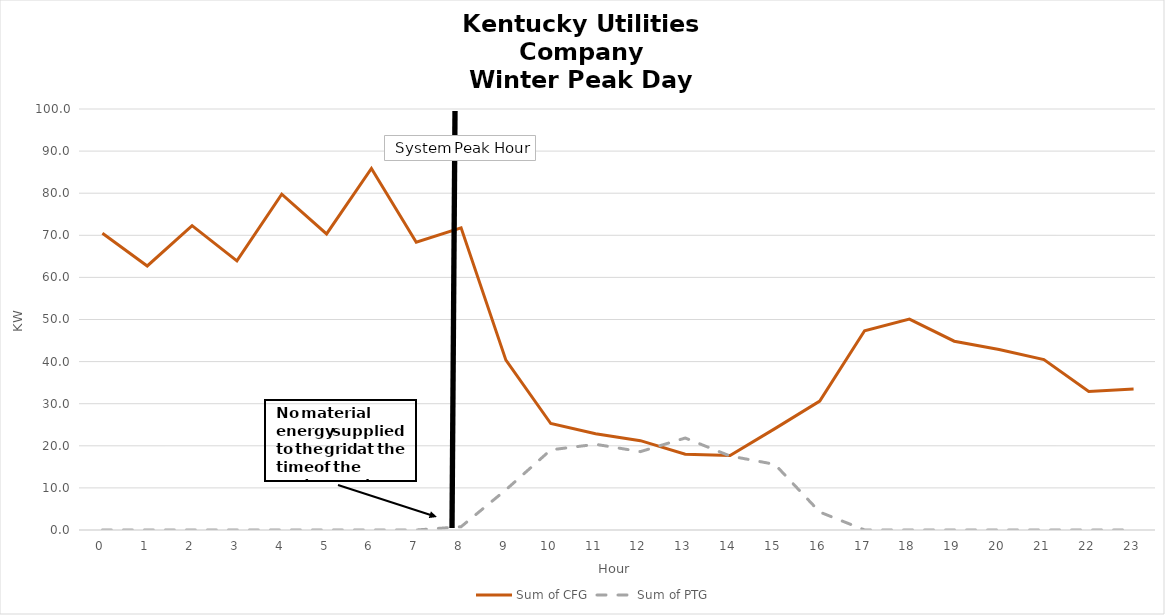
| Category | Sum of CFG | Sum of PTG |
|---|---|---|
| 0.0 | 70.485 | 0 |
| 1.0 | 62.716 | 0 |
| 2.0 | 72.306 | 0 |
| 3.0 | 63.927 | 0 |
| 4.0 | 79.764 | 0 |
| 5.0 | 70.336 | 0 |
| 6.0 | 85.879 | 0 |
| 7.0 | 68.35 | 0 |
| 8.0 | 71.785 | 0.777 |
| 9.0 | 40.345 | 9.553 |
| 10.0 | 25.292 | 19.036 |
| 11.0 | 22.873 | 20.359 |
| 12.0 | 21.222 | 18.615 |
| 13.0 | 17.987 | 21.847 |
| 14.0 | 17.701 | 17.576 |
| 15.0 | 24.085 | 15.587 |
| 16.0 | 30.611 | 4.262 |
| 17.0 | 47.339 | 0.009 |
| 18.0 | 50.084 | 0 |
| 19.0 | 44.844 | 0 |
| 20.0 | 42.856 | 0 |
| 21.0 | 40.473 | 0 |
| 22.0 | 32.878 | 0 |
| 23.0 | 33.469 | 0 |